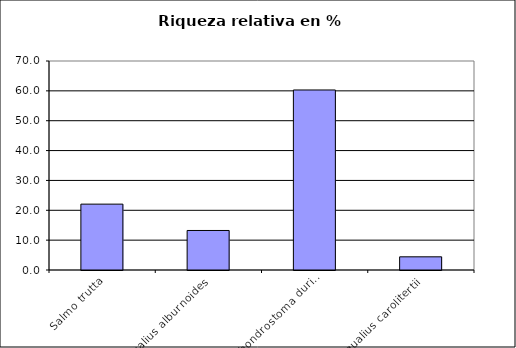
| Category | Series 0 |
|---|---|
| Salmo trutta | 22.059 |
| Squalius alburnoides | 13.235 |
| Pseudochondrostoma duriense | 60.294 |
| Squalius carolitertii | 4.412 |